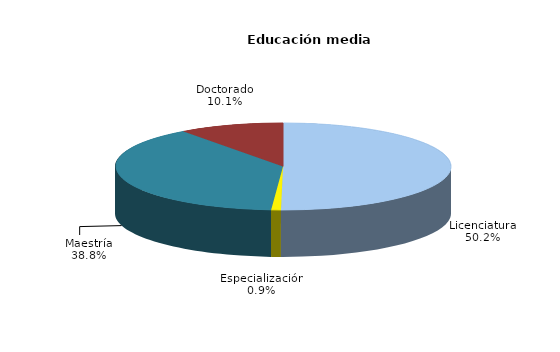
| Category | Series 0 |
|---|---|
| Licenciatura | 648 |
| Especialización | 12 |
| Maestría | 501 |
| Doctorado | 130 |